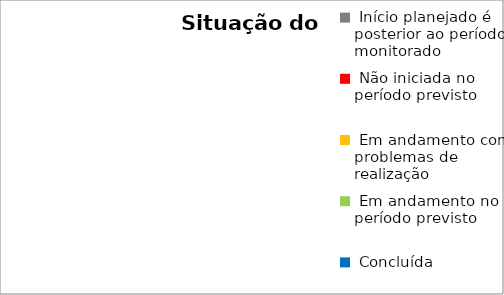
| Category | Series 0 |
|---|---|
|  Início planejado é posterior ao período monitorado | 0 |
|  Não iniciada no período previsto | 0 |
|  Em andamento com problemas de realização | 0 |
|  Em andamento no período previsto  | 0 |
|  Concluída | 0 |
|  Ações Novas - Pós monitoria | 0 |